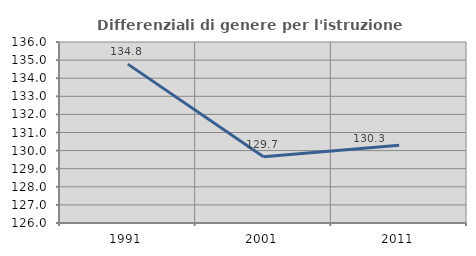
| Category | Differenziali di genere per l'istruzione superiore |
|---|---|
| 1991.0 | 134.778 |
| 2001.0 | 129.655 |
| 2011.0 | 130.296 |